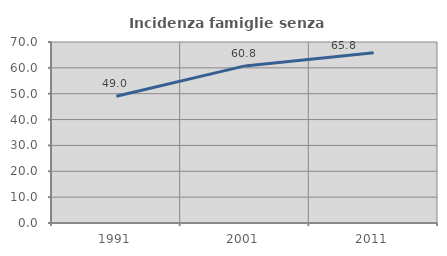
| Category | Incidenza famiglie senza nuclei |
|---|---|
| 1991.0 | 49.02 |
| 2001.0 | 60.753 |
| 2011.0 | 65.829 |